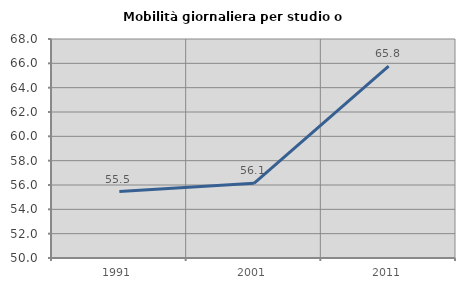
| Category | Mobilità giornaliera per studio o lavoro |
|---|---|
| 1991.0 | 55.464 |
| 2001.0 | 56.134 |
| 2011.0 | 65.769 |